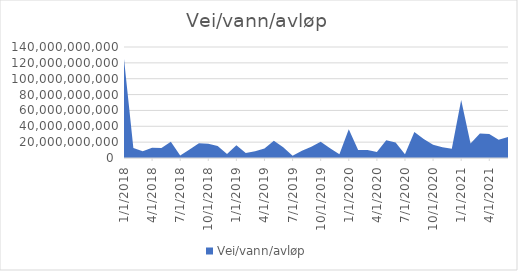
| Category | Vei/vann/avløp |
|---|---|
| 1/1/18 | 124845750000 |
| 2/1/18 | 12745500000 |
| 3/1/18 | 8411935000 |
| 4/1/18 | 12931530000 |
| 5/1/18 | 12593635000 |
| 6/1/18 | 20414885000 |
| 7/1/18 | 3017276000 |
| 8/1/18 | 10678938000 |
| 9/1/18 | 18479440000 |
| 10/1/18 | 18128349000 |
| 11/1/18 | 15130990000 |
| 12/1/18 | 5097780000 |
| 1/1/19 | 16177770000 |
| 2/1/19 | 6388400000 |
| 3/1/19 | 8596400000 |
| 4/1/19 | 11972860000 |
| 5/1/19 | 21827650000 |
| 6/1/19 | 13650000000 |
| 7/1/19 | 2919340000 |
| 8/1/19 | 9259100000 |
| 9/1/19 | 14155300000 |
| 10/1/19 | 20459480000 |
| 11/1/19 | 12296850000 |
| 12/1/19 | 4655050000 |
| 1/1/20 | 36219070000 |
| 2/1/20 | 9975550000 |
| 3/1/20 | 9970075000 |
| 4/1/20 | 7412700000 |
| 5/1/20 | 22234210000 |
| 6/1/20 | 19679705000 |
| 7/1/20 | 4881605000 |
| 8/1/20 | 32926014000 |
| 9/1/20 | 24064350000 |
| 10/1/20 | 16697575000 |
| 11/1/20 | 13538530000 |
| 12/1/20 | 11515750000 |
| 1/1/21 | 73028735000 |
| 2/1/21 | 18315510000 |
| 3/1/21 | 30800950000 |
| 4/1/21 | 30419750000 |
| 5/1/21 | 22908700000 |
| 6/1/21 | 26493020000 |